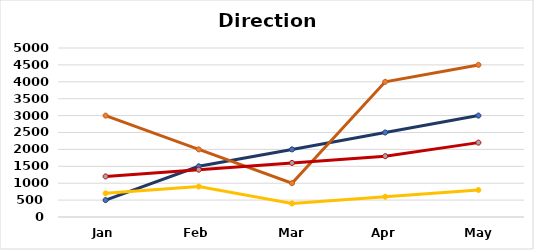
| Category | North | East | west |
|---|---|---|---|
| Jan | 500 | 3000 | 1200 |
| Feb | 1500 | 2000 | 1400 |
| Mar | 2000 | 1000 | 1600 |
| Apr | 2500 | 4000 | 1800 |
| May | 3000 | 4500 | 2200 |